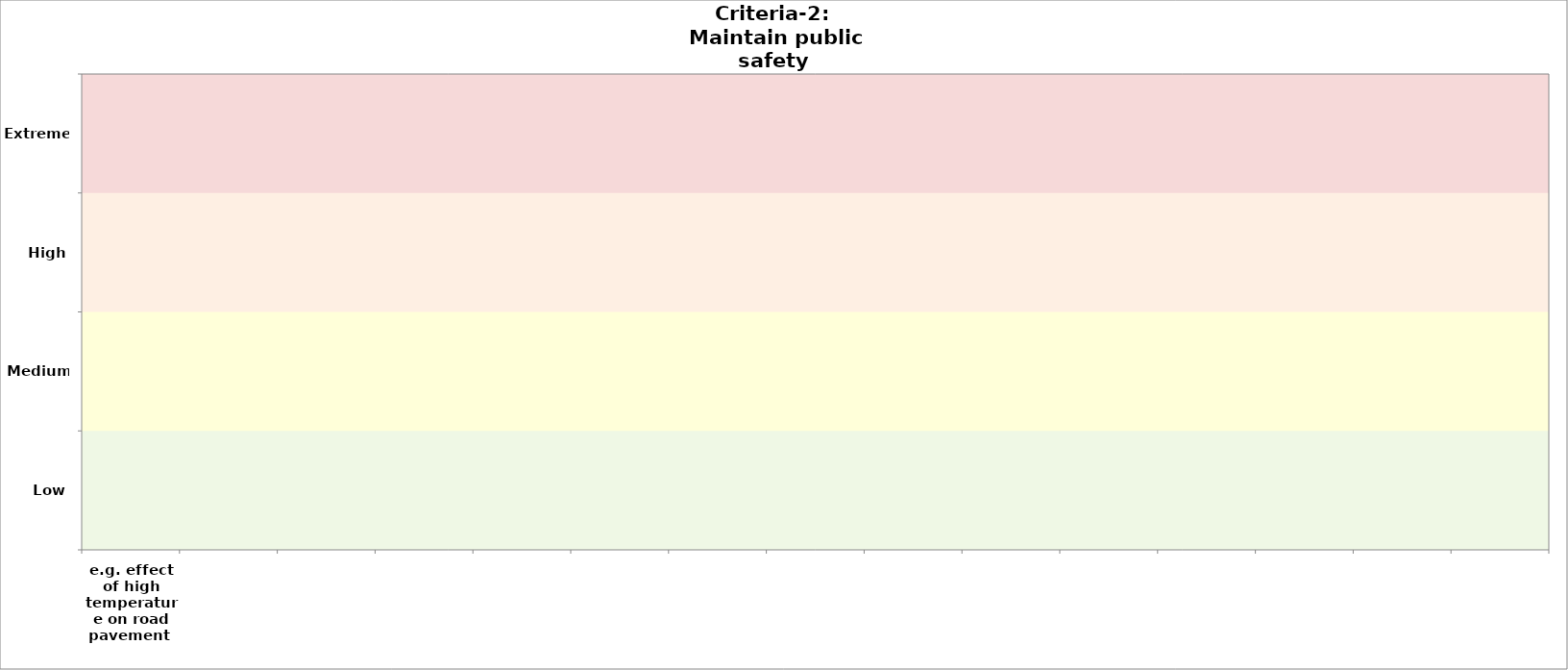
| Category | Criteria-2 
2050 |
|---|---|
| e.g. effect of high temperature on road pavement  | 0 |